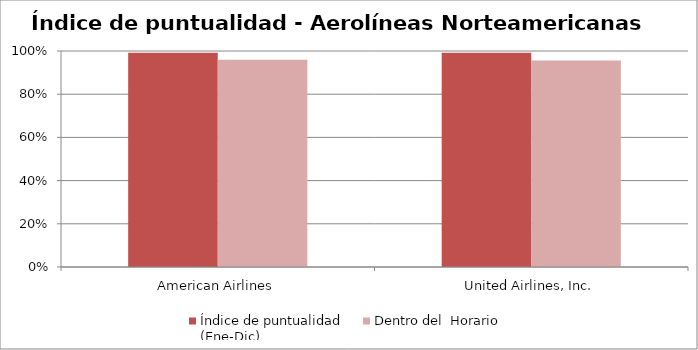
| Category | Índice de puntualidad
(Ene-Dic) | Dentro del  Horario |
|---|---|---|
| American Airlines | 0.992 | 0.96 |
| United Airlines, Inc. | 0.992 | 0.956 |